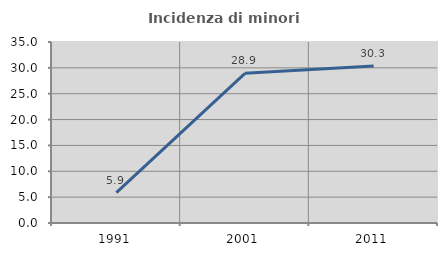
| Category | Incidenza di minori stranieri |
|---|---|
| 1991.0 | 5.882 |
| 2001.0 | 28.947 |
| 2011.0 | 30.343 |